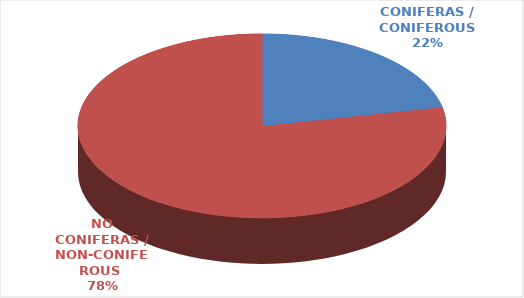
| Category | Series 0 |
|---|---|
| CONIFERAS / CONIFEROUS  | 3930.862 |
| NO CONIFERAS / NON-CONIFEROUS  | 14148.316 |